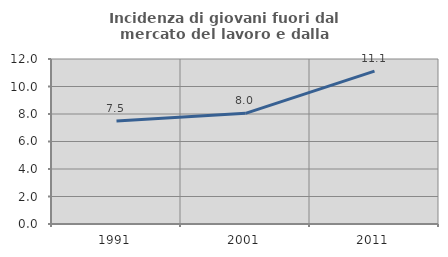
| Category | Incidenza di giovani fuori dal mercato del lavoro e dalla formazione  |
|---|---|
| 1991.0 | 7.494 |
| 2001.0 | 8.048 |
| 2011.0 | 11.12 |